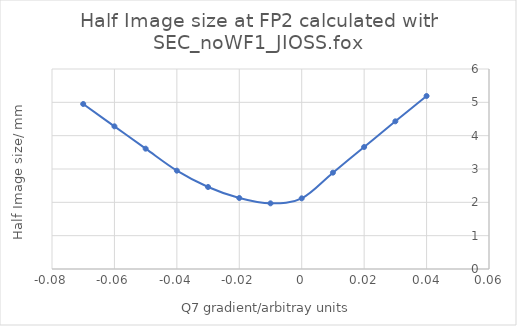
| Category | Series 0 |
|---|---|
| -0.07 | 4.95 |
| -0.060000000000000005 | 4.28 |
| -0.05 | 3.61 |
| -0.04 | 2.95 |
| -0.03 | 2.46 |
| -0.019999999999999997 | 2.13 |
| -0.009999999999999997 | 1.97 |
| 0.0 | 2.12 |
| 0.01 | 2.89 |
| 0.02 | 3.66 |
| 0.03 | 4.43 |
| 0.04 | 5.19 |